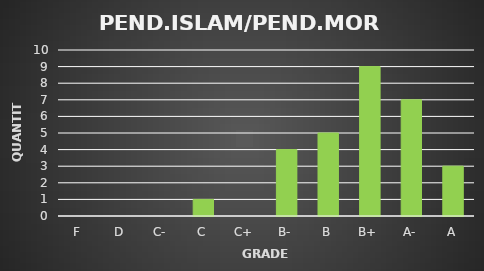
| Category | Series 0 |
|---|---|
| F | 0 |
| D | 0 |
| C- | 0 |
| C | 1 |
| C+ | 0 |
| B- | 4 |
| B | 5 |
| B+ | 9 |
| A- | 7 |
| A | 3 |